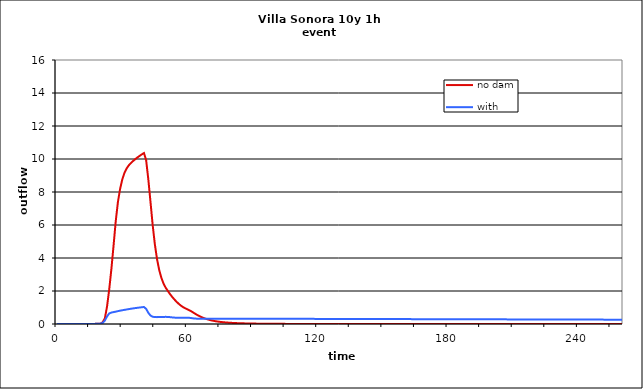
| Category | no dam | with dam |
|---|---|---|
| 0.0 | 0 | 0 |
| 1.0 | 0 | 0 |
| 2.0 | 0 | 0 |
| 3.0 | 0 | 0 |
| 4.0 | 0 | 0 |
| 5.0 | 0 | 0 |
| 6.0 | 0 | 0 |
| 7.0 | 0 | 0 |
| 8.0 | 0 | 0 |
| 9.0 | 0 | 0 |
| 10.0 | 0 | 0 |
| 11.0 | 0 | 0 |
| 12.0 | 0 | 0 |
| 13.0 | 0 | 0 |
| 14.0 | 0 | 0 |
| 15.0 | 0.001 | 0.001 |
| 16.0 | 0.002 | 0.002 |
| 17.0 | 0.005 | 0.005 |
| 18.0 | 0.01 | 0.01 |
| 19.0 | 0.016 | 0.017 |
| 20.0 | 0.022 | 0.024 |
| 21.0 | 0.107 | 0.064 |
| 22.0 | 0.348 | 0.213 |
| 23.0 | 1.063 | 0.459 |
| 24.0 | 2.1 | 0.641 |
| 25.0 | 3.337 | 0.693 |
| 26.0 | 4.754 | 0.721 |
| 27.0 | 6.234 | 0.748 |
| 28.0 | 7.39 | 0.779 |
| 29.0 | 8.183 | 0.808 |
| 30.0 | 8.755 | 0.833 |
| 31.0 | 9.157 | 0.857 |
| 32.0 | 9.426 | 0.88 |
| 33.0 | 9.615 | 0.903 |
| 34.0 | 9.759 | 0.924 |
| 35.0 | 9.881 | 0.945 |
| 36.0 | 9.991 | 0.964 |
| 37.0 | 10.095 | 0.982 |
| 38.0 | 10.191 | 0.999 |
| 39.0 | 10.28 | 1.016 |
| 40.0 | 10.361 | 1.031 |
| 41.0 | 9.92 | 0.916 |
| 42.0 | 8.762 | 0.679 |
| 43.0 | 7.393 | 0.514 |
| 44.0 | 6.001 | 0.44 |
| 45.0 | 4.832 | 0.418 |
| 46.0 | 3.935 | 0.416 |
| 47.0 | 3.276 | 0.421 |
| 48.0 | 2.799 | 0.425 |
| 49.0 | 2.45 | 0.429 |
| 50.0 | 2.196 | 0.433 |
| 51.0 | 1.996 | 0.429 |
| 52.0 | 1.81 | 0.416 |
| 53.0 | 1.64 | 0.399 |
| 54.0 | 1.487 | 0.387 |
| 55.0 | 1.347 | 0.38 |
| 56.0 | 1.222 | 0.377 |
| 57.0 | 1.114 | 0.376 |
| 58.0 | 1.024 | 0.377 |
| 59.0 | 0.949 | 0.378 |
| 60.0 | 0.887 | 0.379 |
| 61.0 | 0.826 | 0.373 |
| 62.0 | 0.751 | 0.355 |
| 63.0 | 0.668 | 0.336 |
| 64.0 | 0.586 | 0.326 |
| 65.0 | 0.512 | 0.322 |
| 66.0 | 0.447 | 0.321 |
| 67.0 | 0.389 | 0.321 |
| 68.0 | 0.338 | 0.322 |
| 69.0 | 0.293 | 0.322 |
| 70.0 | 0.254 | 0.322 |
| 71.0 | 0.221 | 0.322 |
| 72.0 | 0.193 | 0.322 |
| 73.0 | 0.168 | 0.322 |
| 74.0 | 0.148 | 0.322 |
| 75.0 | 0.13 | 0.321 |
| 76.0 | 0.115 | 0.321 |
| 77.0 | 0.102 | 0.321 |
| 78.0 | 0.09 | 0.321 |
| 79.0 | 0.08 | 0.321 |
| 80.0 | 0.072 | 0.321 |
| 81.0 | 0.064 | 0.32 |
| 82.0 | 0.058 | 0.32 |
| 83.0 | 0.052 | 0.32 |
| 84.0 | 0.047 | 0.32 |
| 85.0 | 0.042 | 0.32 |
| 86.0 | 0.038 | 0.319 |
| 87.0 | 0.035 | 0.319 |
| 88.0 | 0.032 | 0.319 |
| 89.0 | 0.029 | 0.319 |
| 90.0 | 0.026 | 0.319 |
| 91.0 | 0.024 | 0.318 |
| 92.0 | 0.022 | 0.318 |
| 93.0 | 0.02 | 0.318 |
| 94.0 | 0.018 | 0.318 |
| 95.0 | 0.017 | 0.317 |
| 96.0 | 0.016 | 0.317 |
| 97.0 | 0.014 | 0.317 |
| 98.0 | 0.013 | 0.317 |
| 99.0 | 0.012 | 0.316 |
| 100.0 | 0.011 | 0.316 |
| 101.0 | 0.01 | 0.316 |
| 102.0 | 0.01 | 0.316 |
| 103.0 | 0.009 | 0.315 |
| 104.0 | 0.008 | 0.315 |
| 105.0 | 0.008 | 0.315 |
| 106.0 | 0.007 | 0.315 |
| 107.0 | 0.006 | 0.314 |
| 108.0 | 0.006 | 0.314 |
| 109.0 | 0.005 | 0.314 |
| 110.0 | 0.005 | 0.313 |
| 111.0 | 0.004 | 0.313 |
| 112.0 | 0.004 | 0.313 |
| 113.0 | 0.003 | 0.312 |
| 114.0 | 0.003 | 0.312 |
| 115.0 | 0.003 | 0.312 |
| 116.0 | 0.002 | 0.311 |
| 117.0 | 0.002 | 0.311 |
| 118.0 | 0.002 | 0.311 |
| 119.0 | 0.002 | 0.31 |
| 120.0 | 0.001 | 0.31 |
| 121.0 | 0.001 | 0.31 |
| 122.0 | 0.001 | 0.309 |
| 123.0 | 0.001 | 0.309 |
| 124.0 | 0.001 | 0.309 |
| 125.0 | 0.001 | 0.308 |
| 126.0 | 0.001 | 0.308 |
| 127.0 | 0.001 | 0.308 |
| 128.0 | 0.001 | 0.307 |
| 129.0 | 0 | 0.307 |
| 130.0 | 0 | 0.307 |
| 131.0 | 0 | 0.306 |
| 132.0 | 0 | 0.306 |
| 133.0 | 0 | 0.306 |
| 134.0 | 0 | 0.305 |
| 135.0 | 0 | 0.305 |
| 136.0 | 0 | 0.305 |
| 137.0 | 0 | 0.304 |
| 138.0 | 0 | 0.304 |
| 139.0 | 0 | 0.304 |
| 140.0 | 0 | 0.303 |
| 141.0 | 0 | 0.303 |
| 142.0 | 0 | 0.303 |
| 143.0 | 0 | 0.302 |
| 144.0 | 0 | 0.302 |
| 145.0 | 0 | 0.302 |
| 146.0 | 0 | 0.301 |
| 147.0 | 0 | 0.301 |
| 148.0 | 0 | 0.3 |
| 149.0 | 0 | 0.3 |
| 150.0 | 0 | 0.3 |
| 151.0 | 0 | 0.299 |
| 152.0 | 0 | 0.299 |
| 153.0 | 0 | 0.299 |
| 154.0 | 0 | 0.298 |
| 155.0 | 0 | 0.298 |
| 156.0 | 0 | 0.298 |
| 157.0 | 0 | 0.297 |
| 158.0 | 0 | 0.297 |
| 159.0 | 0 | 0.297 |
| 160.0 | 0 | 0.296 |
| 161.0 | 0 | 0.296 |
| 162.0 | 0 | 0.296 |
| 163.0 | 0 | 0.295 |
| 164.0 | 0 | 0.295 |
| 165.0 | 0 | 0.295 |
| 166.0 | 0 | 0.294 |
| 167.0 | 0 | 0.294 |
| 168.0 | 0 | 0.294 |
| 169.0 | 0 | 0.293 |
| 170.0 | 0 | 0.293 |
| 171.0 | 0 | 0.293 |
| 172.0 | 0 | 0.292 |
| 173.0 | 0 | 0.292 |
| 174.0 | 0 | 0.292 |
| 175.0 | 0 | 0.291 |
| 176.0 | 0 | 0.291 |
| 177.0 | 0 | 0.291 |
| 178.0 | 0 | 0.29 |
| 179.0 | 0 | 0.29 |
| 180.0 | 0 | 0.29 |
| 181.0 | 0 | 0.289 |
| 182.0 | 0 | 0.289 |
| 183.0 | 0 | 0.288 |
| 184.0 | 0 | 0.288 |
| 185.0 | 0 | 0.288 |
| 186.0 | 0 | 0.287 |
| 187.0 | 0 | 0.287 |
| 188.0 | 0 | 0.287 |
| 189.0 | 0 | 0.286 |
| 190.0 | 0 | 0.286 |
| 191.0 | 0 | 0.286 |
| 192.0 | 0 | 0.285 |
| 193.0 | 0 | 0.285 |
| 194.0 | 0 | 0.285 |
| 195.0 | 0 | 0.284 |
| 196.0 | 0 | 0.284 |
| 197.0 | 0 | 0.284 |
| 198.0 | 0 | 0.283 |
| 199.0 | 0 | 0.283 |
| 200.0 | 0 | 0.283 |
| 201.0 | 0 | 0.282 |
| 202.0 | 0 | 0.282 |
| 203.0 | 0 | 0.282 |
| 204.0 | 0 | 0.281 |
| 205.0 | 0 | 0.281 |
| 206.0 | 0 | 0.281 |
| 207.0 | 0 | 0.28 |
| 208.0 | 0 | 0.28 |
| 209.0 | 0 | 0.28 |
| 210.0 | 0 | 0.279 |
| 211.0 | 0 | 0.279 |
| 212.0 | 0 | 0.279 |
| 213.0 | 0 | 0.278 |
| 214.0 | 0 | 0.278 |
| 215.0 | 0 | 0.277 |
| 216.0 | 0 | 0.277 |
| 217.0 | 0 | 0.277 |
| 218.0 | 0 | 0.276 |
| 219.0 | 0 | 0.276 |
| 220.0 | 0 | 0.276 |
| 221.0 | 0 | 0.275 |
| 222.0 | 0 | 0.275 |
| 223.0 | 0 | 0.275 |
| 224.0 | 0 | 0.274 |
| 225.0 | 0 | 0.274 |
| 226.0 | 0 | 0.274 |
| 227.0 | 0 | 0.273 |
| 228.0 | 0 | 0.273 |
| 229.0 | 0 | 0.273 |
| 230.0 | 0 | 0.272 |
| 231.0 | 0 | 0.272 |
| 232.0 | 0 | 0.272 |
| 233.0 | 0 | 0.271 |
| 234.0 | 0 | 0.271 |
| 235.0 | 0 | 0.271 |
| 236.0 | 0 | 0.27 |
| 237.0 | 0 | 0.27 |
| 238.0 | 0 | 0.27 |
| 239.0 | 0 | 0.269 |
| 240.0 | 0 | 0.269 |
| 241.0 | 0 | 0.269 |
| 242.0 | 0 | 0.268 |
| 243.0 | 0 | 0.268 |
| 244.0 | 0 | 0.268 |
| 245.0 | 0 | 0.267 |
| 246.0 | 0 | 0.267 |
| 247.0 | 0 | 0.267 |
| 248.0 | 0 | 0.266 |
| 249.0 | 0 | 0.266 |
| 250.0 | 0 | 0.266 |
| 251.0 | 0 | 0.265 |
| 252.0 | 0 | 0.265 |
| 253.0 | 0 | 0.265 |
| 254.0 | 0 | 0.264 |
| 255.0 | 0 | 0.264 |
| 256.0 | 0 | 0.263 |
| 257.0 | 0 | 0.263 |
| 258.0 | 0 | 0.263 |
| 259.0 | 0 | 0.262 |
| 260.0 | 0 | 0.262 |